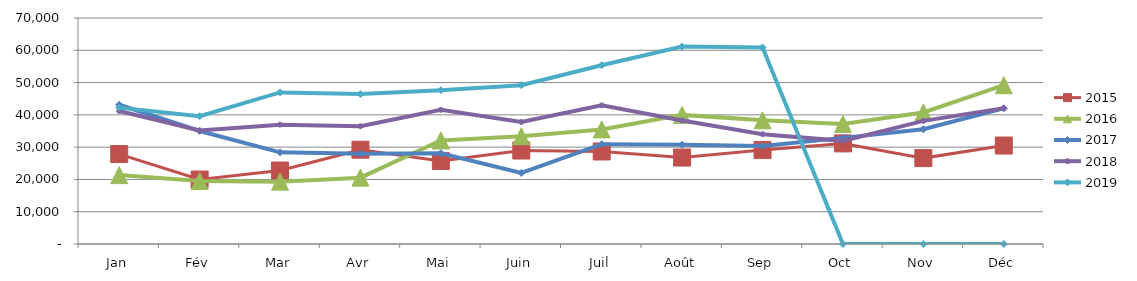
| Category | 2015 | 2016 | 2017 | 2018 | 2019 |
|---|---|---|---|---|---|
| Jan | 27858.045 | 21335.134 | 43138.429 | 41189.736 | 42238.432 |
| Fév | 19964.197 | 19532.337 | 35009.004 | 35137.047 | 39568.195 |
| Mar | 22759.766 | 19313.57 | 28389.673 | 36966.816 | 46942.202 |
| Avr | 29201.77 | 20550.618 | 27972.802 | 36485.223 | 46427.766 |
| Mai | 25732.092 | 32066.609 | 28116.194 | 41558.724 | 47634.031 |
| Juin | 28955.174 | 33383.309 | 22002.869 | 37797.134 | 49186.221 |
| Juil | 28656.613 | 35495.63 | 30926.131 | 42927.847 | 55367.883 |
| Août | 26781.044 | 39992.765 | 30717.708 | 38263.165 | 61146.365 |
| Sep | 29100.698 | 38306.611 | 30378.863 | 34011.672 | 60874.85 |
| Oct | 31157.855 | 37188.976 | 32868.78 | 31946.792 | 0 |
| Nov | 26604.964 | 40729.636 | 35537.079 | 38139.513 | 0 |
| Déc | 30502.489 | 49180.232 | 42040.249 | 42064.579 | 0 |